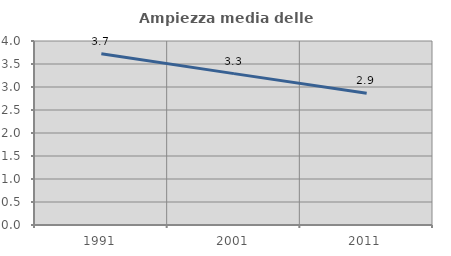
| Category | Ampiezza media delle famiglie |
|---|---|
| 1991.0 | 3.725 |
| 2001.0 | 3.291 |
| 2011.0 | 2.862 |